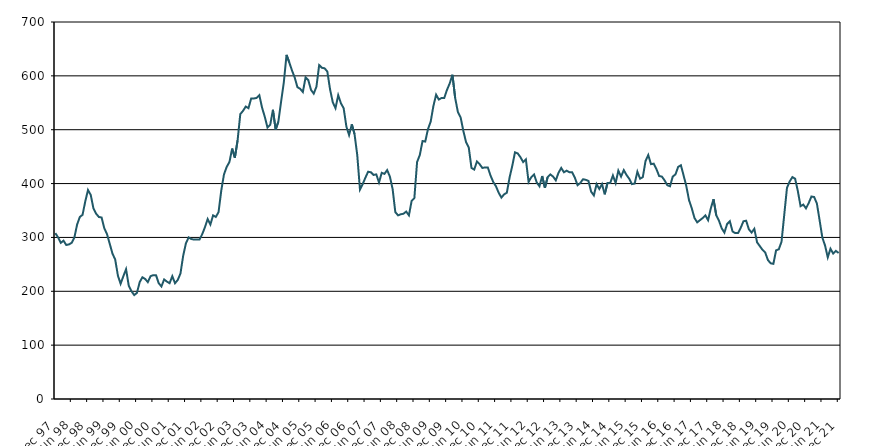
| Category | Series 0 |
|---|---|
| 1997-12-01 | 308 |
| 1998-01-01 | 300 |
| 1998-02-01 | 290 |
| 1998-03-01 | 294 |
| 1998-04-01 | 286 |
| 1998-05-01 | 287 |
| 1998-06-01 | 290 |
| 1998-07-01 | 300 |
| 1998-08-01 | 324 |
| 1998-09-01 | 338 |
| 1998-10-01 | 342 |
| 1998-11-01 | 367 |
| 1998-12-01 | 388 |
| 1999-01-01 | 379 |
| 1999-02-01 | 354 |
| 1999-03-01 | 344 |
| 1999-04-01 | 338 |
| 1999-05-01 | 337 |
| 1999-06-01 | 317 |
| 1999-07-01 | 306 |
| 1999-08-01 | 288 |
| 1999-09-01 | 270 |
| 1999-10-01 | 259 |
| 1999-11-01 | 229 |
| 1999-12-01 | 214 |
| 2000-01-01 | 228 |
| 2000-02-01 | 241 |
| 2000-03-01 | 210 |
| 2000-04-01 | 200 |
| 2000-05-01 | 193 |
| 2000-06-01 | 197 |
| 2000-07-01 | 217 |
| 2000-08-01 | 226 |
| 2000-09-01 | 223 |
| 2000-10-01 | 217 |
| 2000-11-01 | 228 |
| 2000-12-01 | 230 |
| 2001-01-01 | 230 |
| 2001-02-01 | 215 |
| 2001-03-01 | 209 |
| 2001-04-01 | 222 |
| 2001-05-01 | 218 |
| 2001-06-01 | 215 |
| 2001-07-01 | 228 |
| 2001-08-01 | 215 |
| 2001-09-01 | 221 |
| 2001-10-01 | 233 |
| 2001-11-01 | 266 |
| 2001-12-01 | 289 |
| 2002-01-01 | 300 |
| 2002-02-01 | 297 |
| 2002-03-01 | 296 |
| 2002-04-01 | 296 |
| 2002-05-01 | 296 |
| 2002-06-01 | 306 |
| 2002-07-01 | 319 |
| 2002-08-01 | 334 |
| 2002-09-01 | 324 |
| 2002-10-01 | 341 |
| 2002-11-01 | 338 |
| 2002-12-01 | 347 |
| 2003-01-01 | 387 |
| 2003-02-01 | 417 |
| 2003-03-01 | 431 |
| 2003-04-01 | 440 |
| 2003-05-01 | 465 |
| 2003-06-01 | 448 |
| 2003-07-01 | 480 |
| 2003-08-01 | 529 |
| 2003-09-01 | 535 |
| 2003-10-01 | 543 |
| 2003-11-01 | 540 |
| 2003-12-01 | 558 |
| 2004-01-01 | 558 |
| 2004-02-01 | 559 |
| 2004-03-01 | 564 |
| 2004-04-01 | 541 |
| 2004-05-01 | 524 |
| 2004-06-01 | 504 |
| 2004-07-01 | 509 |
| 2004-08-01 | 537 |
| 2004-09-01 | 500 |
| 2004-10-01 | 515 |
| 2004-11-01 | 552 |
| 2004-12-01 | 588 |
| 2005-01-01 | 639 |
| 2005-02-01 | 625 |
| 2005-03-01 | 610 |
| 2005-04-01 | 597 |
| 2005-05-01 | 579 |
| 2005-06-01 | 576 |
| 2005-07-01 | 570 |
| 2005-08-01 | 597 |
| 2005-09-01 | 592 |
| 2005-10-01 | 574 |
| 2005-11-01 | 567 |
| 2005-12-01 | 580 |
| 2006-01-01 | 620 |
| 2006-02-01 | 615 |
| 2006-03-01 | 614 |
| 2006-04-01 | 608 |
| 2006-05-01 | 575 |
| 2006-06-01 | 551 |
| 2006-07-01 | 540 |
| 2006-08-01 | 564 |
| 2006-09-01 | 549 |
| 2006-10-01 | 540 |
| 2006-11-01 | 506 |
| 2006-12-01 | 490 |
| 2007-01-01 | 510 |
| 2007-02-01 | 492 |
| 2007-03-01 | 453 |
| 2007-04-01 | 389 |
| 2007-05-01 | 399 |
| 2007-06-01 | 411 |
| 2007-07-01 | 422 |
| 2007-08-01 | 421 |
| 2007-09-01 | 416 |
| 2007-10-01 | 417 |
| 2007-11-01 | 402 |
| 2007-12-01 | 420 |
| 2008-01-01 | 418 |
| 2008-02-01 | 425 |
| 2008-03-01 | 413 |
| 2008-04-01 | 390 |
| 2008-05-01 | 347 |
| 2008-06-01 | 341 |
| 2008-07-01 | 343 |
| 2008-08-01 | 344 |
| 2008-09-01 | 348 |
| 2008-10-01 | 341 |
| 2008-11-01 | 368 |
| 2008-12-01 | 373 |
| 2009-01-01 | 440 |
| 2009-02-01 | 453 |
| 2009-03-01 | 479 |
| 2009-04-01 | 478 |
| 2009-05-01 | 501 |
| 2009-06-01 | 515 |
| 2009-07-01 | 544 |
| 2009-08-01 | 565 |
| 2009-09-01 | 556 |
| 2009-10-01 | 559 |
| 2009-11-01 | 559 |
| 2009-12-01 | 574 |
| 2010-01-01 | 586 |
| 2010-02-01 | 602 |
| 2010-03-01 | 559 |
| 2010-04-01 | 533 |
| 2010-05-01 | 523 |
| 2010-06-01 | 498 |
| 2010-07-01 | 477 |
| 2010-08-01 | 467 |
| 2010-09-01 | 429 |
| 2010-10-01 | 426 |
| 2010-11-01 | 441 |
| 2010-12-01 | 436 |
| 2011-01-01 | 429 |
| 2011-02-01 | 430 |
| 2011-03-01 | 430 |
| 2011-04-01 | 415 |
| 2011-05-01 | 403 |
| 2011-06-01 | 395 |
| 2011-07-01 | 383 |
| 2011-08-01 | 374 |
| 2011-09-01 | 380 |
| 2011-10-01 | 383 |
| 2011-11-01 | 411 |
| 2011-12-01 | 433 |
| 2012-01-01 | 458 |
| 2012-02-01 | 456 |
| 2012-03-01 | 449 |
| 2012-04-01 | 440 |
| 2012-05-01 | 445 |
| 2012-06-01 | 403 |
| 2012-07-01 | 412 |
| 2012-08-01 | 417 |
| 2012-09-01 | 402 |
| 2012-10-01 | 395 |
| 2012-11-01 | 414 |
| 2012-12-01 | 392 |
| 2013-01-01 | 412 |
| 2013-02-01 | 417 |
| 2013-03-01 | 413 |
| 2013-04-01 | 406 |
| 2013-05-01 | 420 |
| 2013-06-01 | 429 |
| 2013-07-01 | 421 |
| 2013-08-01 | 424 |
| 2013-09-01 | 421 |
| 2013-10-01 | 421 |
| 2013-11-01 | 411 |
| 2013-12-01 | 397 |
| 2014-01-01 | 401 |
| 2014-02-01 | 408 |
| 2014-03-01 | 407 |
| 2014-04-01 | 405 |
| 2014-05-01 | 385 |
| 2014-06-01 | 378 |
| 2014-07-01 | 399 |
| 2014-08-01 | 390 |
| 2014-09-01 | 399 |
| 2014-10-01 | 380 |
| 2014-11-01 | 401 |
| 2014-12-01 | 401 |
| 2015-01-01 | 415 |
| 2015-02-01 | 401 |
| 2015-03-01 | 424 |
| 2015-04-01 | 413 |
| 2015-05-01 | 425 |
| 2015-06-01 | 416 |
| 2015-07-01 | 409 |
| 2015-08-01 | 399 |
| 2015-09-01 | 400 |
| 2015-10-01 | 422 |
| 2015-11-01 | 409 |
| 2015-12-01 | 412 |
| 2016-01-01 | 442 |
| 2016-02-01 | 453 |
| 2016-03-01 | 436 |
| 2016-04-01 | 437 |
| 2016-05-01 | 427 |
| 2016-06-01 | 414 |
| 2016-07-01 | 413 |
| 2016-08-01 | 406 |
| 2016-09-01 | 397 |
| 2016-10-01 | 395 |
| 2016-11-01 | 413 |
| 2016-12-01 | 417 |
| 2017-01-01 | 431 |
| 2017-02-01 | 434 |
| 2017-03-01 | 415 |
| 2017-04-01 | 395 |
| 2017-05-01 | 369 |
| 2017-06-01 | 354 |
| 2017-07-01 | 336 |
| 2017-08-01 | 328 |
| 2017-09-01 | 332 |
| 2017-10-01 | 336 |
| 2017-11-01 | 341 |
| 2017-12-01 | 332 |
| 2018-01-01 | 354 |
| 2018-02-01 | 371 |
| 2018-03-01 | 341 |
| 2018-04-01 | 331 |
| 2018-05-01 | 317 |
| 2018-06-01 | 309 |
| 2018-07-01 | 325 |
| 2018-08-01 | 330 |
| 2018-09-01 | 311 |
| 2018-10-01 | 308 |
| 2018-11-01 | 308 |
| 2018-12-01 | 318 |
| 2019-01-01 | 330 |
| 2019-02-01 | 331 |
| 2019-03-01 | 315 |
| 2019-04-01 | 309 |
| 2019-05-01 | 316 |
| 2019-06-01 | 291 |
| 2019-07-01 | 284 |
| 2019-08-01 | 277 |
| 2019-09-01 | 272 |
| 2019-10-01 | 258 |
| 2019-11-01 | 252 |
| 2019-12-01 | 251 |
| 2020-01-01 | 276 |
| 2020-02-01 | 278 |
| 2020-03-01 | 292 |
| 2020-04-01 | 342 |
| 2020-05-01 | 392 |
| 2020-06-01 | 404 |
| 2020-07-01 | 412 |
| 2020-08-01 | 409 |
| 2020-09-01 | 386 |
| 2020-10-01 | 358 |
| 2020-11-01 | 361 |
| 2020-12-01 | 354 |
| 2021-01-01 | 364 |
| 2021-02-01 | 376 |
| 2021-03-01 | 375 |
| 2021-04-01 | 363 |
| 2021-05-01 | 332 |
| 2021-06-01 | 300 |
| 2021-07-01 | 285 |
| 2021-08-01 | 263 |
| 2021-09-01 | 279 |
| 2021-10-01 | 270 |
| 2021-11-01 | 275 |
| 2021-12-01 | 271 |